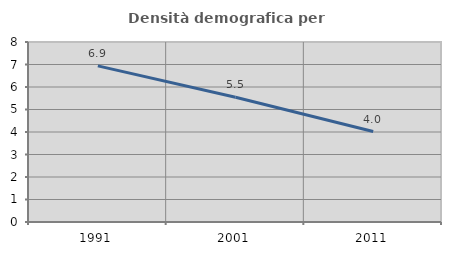
| Category | Densità demografica |
|---|---|
| 1991.0 | 6.938 |
| 2001.0 | 5.542 |
| 2011.0 | 4.019 |